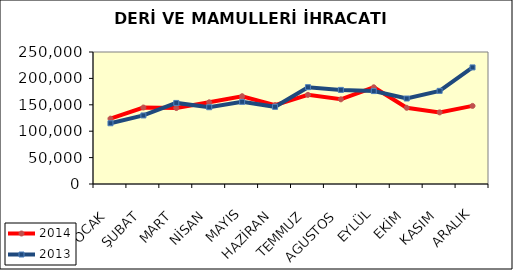
| Category | 2014 | 2013 |
|---|---|---|
| OCAK | 123768.856 | 115029.788 |
| ŞUBAT | 144819.589 | 129821.131 |
| MART | 143825.703 | 153555.928 |
| NİSAN | 154749.486 | 145412.842 |
| MAYIS | 166273.724 | 155575.822 |
| HAZİRAN | 149427.528 | 146133.846 |
| TEMMUZ | 168859.903 | 183365.385 |
| AGUSTOS | 160366.979 | 178226.113 |
| EYLÜL | 183148.219 | 175967.321 |
| EKİM | 144352.189 | 161907.5 |
| KASIM | 135646.812 | 176429.779 |
| ARALIK | 147908.005 | 220812.817 |